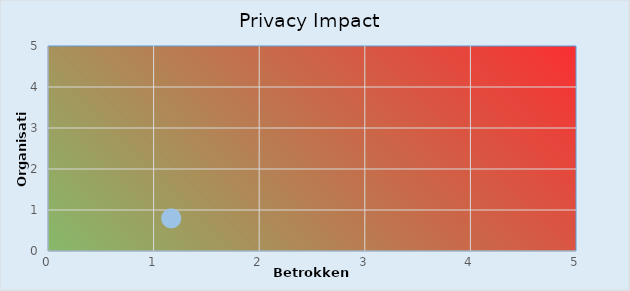
| Category | Privacy Impact |
|---|---|
| 1.1666666666666667 | 0.796 |